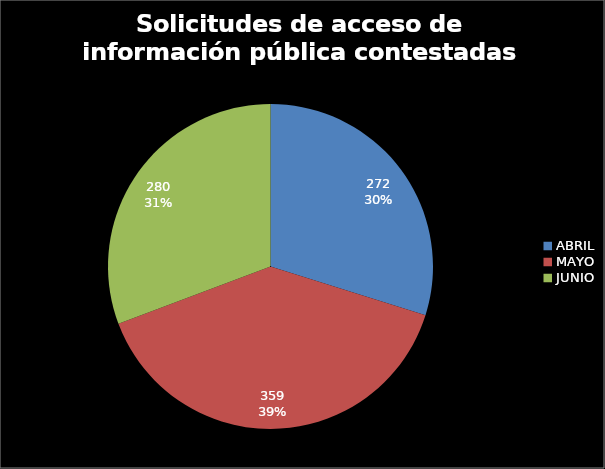
| Category | Solicitudes de acceso de información pública contestadas desde la UAC |
|---|---|
| ABRIL | 272 |
| MAYO | 359 |
| JUNIO | 280 |